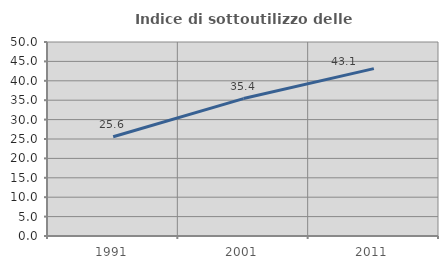
| Category | Indice di sottoutilizzo delle abitazioni  |
|---|---|
| 1991.0 | 25.569 |
| 2001.0 | 35.421 |
| 2011.0 | 43.143 |